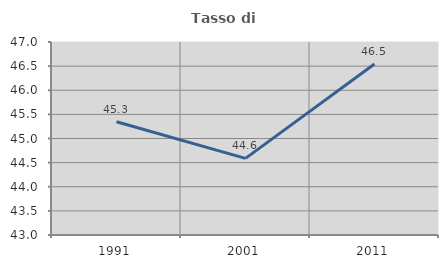
| Category | Tasso di occupazione   |
|---|---|
| 1991.0 | 45.347 |
| 2001.0 | 44.588 |
| 2011.0 | 46.543 |